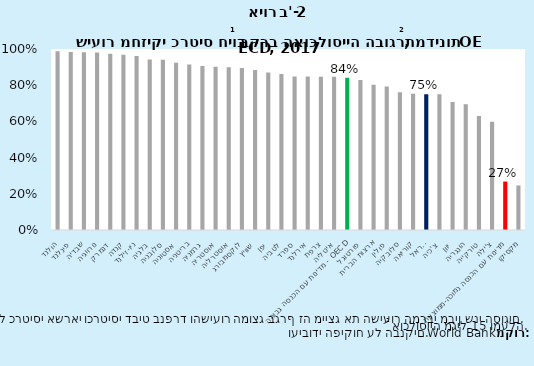
| Category | כרטיסי אשראי ודביט |
|---|---|
| הולנד | 0.988 |
| פינלנד | 0.983 |
| שבדיה | 0.982 |
| נורווגיה | 0.981 |
| דנמרק | 0.974 |
| קנדה | 0.968 |
| ניו-זילנד | 0.962 |
| בלגיה | 0.942 |
| סלובניה | 0.94 |
| אסטוניה | 0.924 |
| בריטניה | 0.915 |
| גרמניה | 0.906 |
| אוסטריה | 0.902 |
| אוסטרליה | 0.9 |
| לוקסמבורג | 0.895 |
| שוויץ | 0.885 |
| יפן | 0.87 |
| לטביה | 0.862 |
| ספרד | 0.848 |
| אירלנד | 0.847 |
| צרפת | 0.847 |
| איטליה | 0.846 |
| מדינות עם הכנסה גבוהה - OECD | 0.842 |
| פורטוגל | 0.829 |
| ארצות הברית | 0.802 |
| פולין | 0.793 |
| סלובקיה | 0.761 |
| קוריאה | 0.753 |
| ישראל | 0.75 |
| צ'כיה | 0.75 |
| יוון | 0.707 |
| הונגריה | 0.695 |
| טורקייה | 0.63 |
| צ'ילה | 0.598 |
| מדינות עם הכנסה נמוכה-ממוצעת | 0.268 |
| מקסיקו | 0.246 |